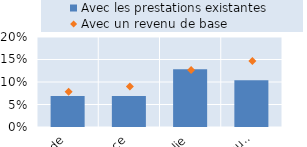
| Category | Avec les prestations existantes |
|---|---|
| Finlande | 0.069 |
| France | 0.069 |
| Italie | 0.128 |
| Royaume-Uni | 0.104 |